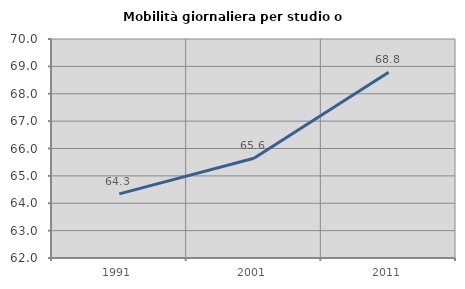
| Category | Mobilità giornaliera per studio o lavoro |
|---|---|
| 1991.0 | 64.343 |
| 2001.0 | 65.641 |
| 2011.0 | 68.786 |